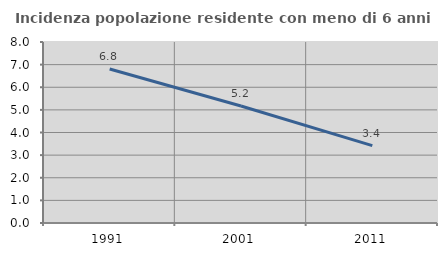
| Category | Incidenza popolazione residente con meno di 6 anni |
|---|---|
| 1991.0 | 6.805 |
| 2001.0 | 5.173 |
| 2011.0 | 3.42 |